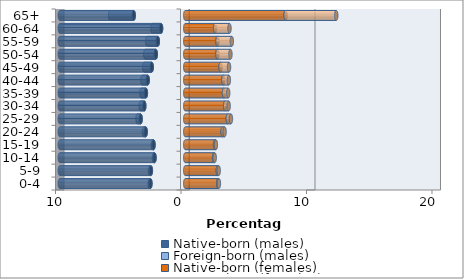
| Category | Native-born (males) | Foreign-born (males) | Native-born (females) | Foreign-born (females) |
|---|---|---|---|---|
| 0-4 | -2.774 | -0.062 | 2.62 | 0.061 |
| 5-9 | -2.74 | -0.072 | 2.59 | 0.075 |
| 10-14 | -2.448 | -0.049 | 2.293 | 0.054 |
| 15-19 | -2.529 | -0.059 | 2.374 | 0.066 |
| 20-24 | -3.153 | -0.146 | 2.978 | 0.157 |
| 25-29 | -3.554 | -0.25 | 3.39 | 0.25 |
| 30-34 | -3.264 | -0.295 | 3.176 | 0.282 |
| 35-39 | -3.137 | -0.349 | 3.082 | 0.338 |
| 40-44 | -2.991 | -0.422 | 3.04 | 0.435 |
| 45-49 | -2.671 | -0.599 | 2.815 | 0.674 |
| 50-54 | -2.349 | -0.841 | 2.562 | 1.039 |
| 55-59 | -2.188 | -0.845 | 2.565 | 1.146 |
| 60-64 | -1.927 | -0.684 | 2.376 | 1.149 |
| 65+ | -4.107 | -1.879 | 7.996 | 4.036 |